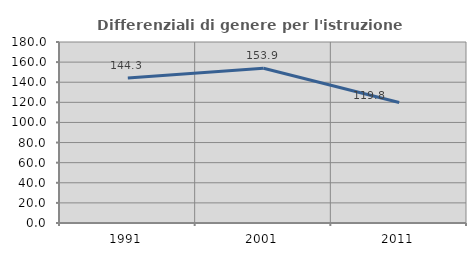
| Category | Differenziali di genere per l'istruzione superiore |
|---|---|
| 1991.0 | 144.277 |
| 2001.0 | 153.851 |
| 2011.0 | 119.833 |